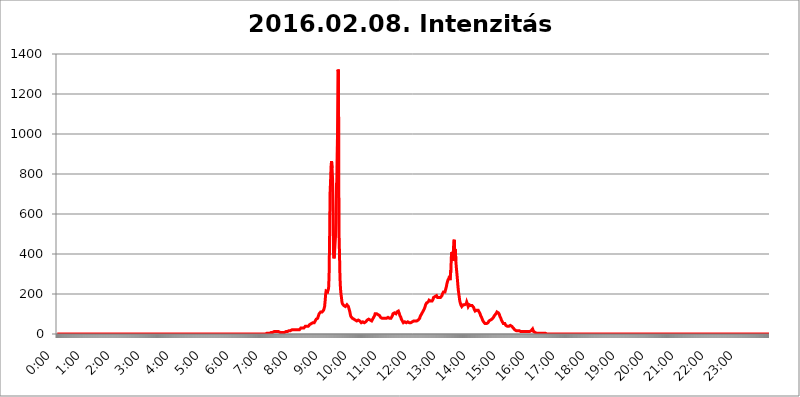
| Category | 2016.02.08. Intenzitás [W/m^2] |
|---|---|
| 0.0 | 0 |
| 0.0006944444444444445 | 0 |
| 0.001388888888888889 | 0 |
| 0.0020833333333333333 | 0 |
| 0.002777777777777778 | 0 |
| 0.003472222222222222 | 0 |
| 0.004166666666666667 | 0 |
| 0.004861111111111111 | 0 |
| 0.005555555555555556 | 0 |
| 0.0062499999999999995 | 0 |
| 0.006944444444444444 | 0 |
| 0.007638888888888889 | 0 |
| 0.008333333333333333 | 0 |
| 0.009027777777777779 | 0 |
| 0.009722222222222222 | 0 |
| 0.010416666666666666 | 0 |
| 0.011111111111111112 | 0 |
| 0.011805555555555555 | 0 |
| 0.012499999999999999 | 0 |
| 0.013194444444444444 | 0 |
| 0.013888888888888888 | 0 |
| 0.014583333333333332 | 0 |
| 0.015277777777777777 | 0 |
| 0.015972222222222224 | 0 |
| 0.016666666666666666 | 0 |
| 0.017361111111111112 | 0 |
| 0.018055555555555557 | 0 |
| 0.01875 | 0 |
| 0.019444444444444445 | 0 |
| 0.02013888888888889 | 0 |
| 0.020833333333333332 | 0 |
| 0.02152777777777778 | 0 |
| 0.022222222222222223 | 0 |
| 0.02291666666666667 | 0 |
| 0.02361111111111111 | 0 |
| 0.024305555555555556 | 0 |
| 0.024999999999999998 | 0 |
| 0.025694444444444447 | 0 |
| 0.02638888888888889 | 0 |
| 0.027083333333333334 | 0 |
| 0.027777777777777776 | 0 |
| 0.02847222222222222 | 0 |
| 0.029166666666666664 | 0 |
| 0.029861111111111113 | 0 |
| 0.030555555555555555 | 0 |
| 0.03125 | 0 |
| 0.03194444444444445 | 0 |
| 0.03263888888888889 | 0 |
| 0.03333333333333333 | 0 |
| 0.034027777777777775 | 0 |
| 0.034722222222222224 | 0 |
| 0.035416666666666666 | 0 |
| 0.036111111111111115 | 0 |
| 0.03680555555555556 | 0 |
| 0.0375 | 0 |
| 0.03819444444444444 | 0 |
| 0.03888888888888889 | 0 |
| 0.03958333333333333 | 0 |
| 0.04027777777777778 | 0 |
| 0.04097222222222222 | 0 |
| 0.041666666666666664 | 0 |
| 0.042361111111111106 | 0 |
| 0.04305555555555556 | 0 |
| 0.043750000000000004 | 0 |
| 0.044444444444444446 | 0 |
| 0.04513888888888889 | 0 |
| 0.04583333333333334 | 0 |
| 0.04652777777777778 | 0 |
| 0.04722222222222222 | 0 |
| 0.04791666666666666 | 0 |
| 0.04861111111111111 | 0 |
| 0.049305555555555554 | 0 |
| 0.049999999999999996 | 0 |
| 0.05069444444444445 | 0 |
| 0.051388888888888894 | 0 |
| 0.052083333333333336 | 0 |
| 0.05277777777777778 | 0 |
| 0.05347222222222222 | 0 |
| 0.05416666666666667 | 0 |
| 0.05486111111111111 | 0 |
| 0.05555555555555555 | 0 |
| 0.05625 | 0 |
| 0.05694444444444444 | 0 |
| 0.057638888888888885 | 0 |
| 0.05833333333333333 | 0 |
| 0.05902777777777778 | 0 |
| 0.059722222222222225 | 0 |
| 0.06041666666666667 | 0 |
| 0.061111111111111116 | 0 |
| 0.06180555555555556 | 0 |
| 0.0625 | 0 |
| 0.06319444444444444 | 0 |
| 0.06388888888888888 | 0 |
| 0.06458333333333334 | 0 |
| 0.06527777777777778 | 0 |
| 0.06597222222222222 | 0 |
| 0.06666666666666667 | 0 |
| 0.06736111111111111 | 0 |
| 0.06805555555555555 | 0 |
| 0.06874999999999999 | 0 |
| 0.06944444444444443 | 0 |
| 0.07013888888888889 | 0 |
| 0.07083333333333333 | 0 |
| 0.07152777777777779 | 0 |
| 0.07222222222222223 | 0 |
| 0.07291666666666667 | 0 |
| 0.07361111111111111 | 0 |
| 0.07430555555555556 | 0 |
| 0.075 | 0 |
| 0.07569444444444444 | 0 |
| 0.0763888888888889 | 0 |
| 0.07708333333333334 | 0 |
| 0.07777777777777778 | 0 |
| 0.07847222222222222 | 0 |
| 0.07916666666666666 | 0 |
| 0.0798611111111111 | 0 |
| 0.08055555555555556 | 0 |
| 0.08125 | 0 |
| 0.08194444444444444 | 0 |
| 0.08263888888888889 | 0 |
| 0.08333333333333333 | 0 |
| 0.08402777777777777 | 0 |
| 0.08472222222222221 | 0 |
| 0.08541666666666665 | 0 |
| 0.08611111111111112 | 0 |
| 0.08680555555555557 | 0 |
| 0.08750000000000001 | 0 |
| 0.08819444444444445 | 0 |
| 0.08888888888888889 | 0 |
| 0.08958333333333333 | 0 |
| 0.09027777777777778 | 0 |
| 0.09097222222222222 | 0 |
| 0.09166666666666667 | 0 |
| 0.09236111111111112 | 0 |
| 0.09305555555555556 | 0 |
| 0.09375 | 0 |
| 0.09444444444444444 | 0 |
| 0.09513888888888888 | 0 |
| 0.09583333333333333 | 0 |
| 0.09652777777777777 | 0 |
| 0.09722222222222222 | 0 |
| 0.09791666666666667 | 0 |
| 0.09861111111111111 | 0 |
| 0.09930555555555555 | 0 |
| 0.09999999999999999 | 0 |
| 0.10069444444444443 | 0 |
| 0.1013888888888889 | 0 |
| 0.10208333333333335 | 0 |
| 0.10277777777777779 | 0 |
| 0.10347222222222223 | 0 |
| 0.10416666666666667 | 0 |
| 0.10486111111111111 | 0 |
| 0.10555555555555556 | 0 |
| 0.10625 | 0 |
| 0.10694444444444444 | 0 |
| 0.1076388888888889 | 0 |
| 0.10833333333333334 | 0 |
| 0.10902777777777778 | 0 |
| 0.10972222222222222 | 0 |
| 0.1111111111111111 | 0 |
| 0.11180555555555556 | 0 |
| 0.11180555555555556 | 0 |
| 0.1125 | 0 |
| 0.11319444444444444 | 0 |
| 0.11388888888888889 | 0 |
| 0.11458333333333333 | 0 |
| 0.11527777777777777 | 0 |
| 0.11597222222222221 | 0 |
| 0.11666666666666665 | 0 |
| 0.1173611111111111 | 0 |
| 0.11805555555555557 | 0 |
| 0.11944444444444445 | 0 |
| 0.12013888888888889 | 0 |
| 0.12083333333333333 | 0 |
| 0.12152777777777778 | 0 |
| 0.12222222222222223 | 0 |
| 0.12291666666666667 | 0 |
| 0.12291666666666667 | 0 |
| 0.12361111111111112 | 0 |
| 0.12430555555555556 | 0 |
| 0.125 | 0 |
| 0.12569444444444444 | 0 |
| 0.12638888888888888 | 0 |
| 0.12708333333333333 | 0 |
| 0.16875 | 0 |
| 0.12847222222222224 | 0 |
| 0.12916666666666668 | 0 |
| 0.12986111111111112 | 0 |
| 0.13055555555555556 | 0 |
| 0.13125 | 0 |
| 0.13194444444444445 | 0 |
| 0.1326388888888889 | 0 |
| 0.13333333333333333 | 0 |
| 0.13402777777777777 | 0 |
| 0.13402777777777777 | 0 |
| 0.13472222222222222 | 0 |
| 0.13541666666666666 | 0 |
| 0.1361111111111111 | 0 |
| 0.13749999999999998 | 0 |
| 0.13819444444444443 | 0 |
| 0.1388888888888889 | 0 |
| 0.13958333333333334 | 0 |
| 0.14027777777777778 | 0 |
| 0.14097222222222222 | 0 |
| 0.14166666666666666 | 0 |
| 0.1423611111111111 | 0 |
| 0.14305555555555557 | 0 |
| 0.14375000000000002 | 0 |
| 0.14444444444444446 | 0 |
| 0.1451388888888889 | 0 |
| 0.1451388888888889 | 0 |
| 0.14652777777777778 | 0 |
| 0.14722222222222223 | 0 |
| 0.14791666666666667 | 0 |
| 0.1486111111111111 | 0 |
| 0.14930555555555555 | 0 |
| 0.15 | 0 |
| 0.15069444444444444 | 0 |
| 0.15138888888888888 | 0 |
| 0.15208333333333332 | 0 |
| 0.15277777777777776 | 0 |
| 0.15347222222222223 | 0 |
| 0.15416666666666667 | 0 |
| 0.15486111111111112 | 0 |
| 0.15555555555555556 | 0 |
| 0.15625 | 0 |
| 0.15694444444444444 | 0 |
| 0.15763888888888888 | 0 |
| 0.15833333333333333 | 0 |
| 0.15902777777777777 | 0 |
| 0.15972222222222224 | 0 |
| 0.16041666666666668 | 0 |
| 0.16111111111111112 | 0 |
| 0.16180555555555556 | 0 |
| 0.1625 | 0 |
| 0.16319444444444445 | 0 |
| 0.1638888888888889 | 0 |
| 0.16458333333333333 | 0 |
| 0.16527777777777777 | 0 |
| 0.16597222222222222 | 0 |
| 0.16666666666666666 | 0 |
| 0.1673611111111111 | 0 |
| 0.16805555555555554 | 0 |
| 0.16874999999999998 | 0 |
| 0.16944444444444443 | 0 |
| 0.17013888888888887 | 0 |
| 0.1708333333333333 | 0 |
| 0.17152777777777775 | 0 |
| 0.17222222222222225 | 0 |
| 0.1729166666666667 | 0 |
| 0.17361111111111113 | 0 |
| 0.17430555555555557 | 0 |
| 0.17500000000000002 | 0 |
| 0.17569444444444446 | 0 |
| 0.1763888888888889 | 0 |
| 0.17708333333333334 | 0 |
| 0.17777777777777778 | 0 |
| 0.17847222222222223 | 0 |
| 0.17916666666666667 | 0 |
| 0.1798611111111111 | 0 |
| 0.18055555555555555 | 0 |
| 0.18125 | 0 |
| 0.18194444444444444 | 0 |
| 0.1826388888888889 | 0 |
| 0.18333333333333335 | 0 |
| 0.1840277777777778 | 0 |
| 0.18472222222222223 | 0 |
| 0.18541666666666667 | 0 |
| 0.18611111111111112 | 0 |
| 0.18680555555555556 | 0 |
| 0.1875 | 0 |
| 0.18819444444444444 | 0 |
| 0.18888888888888888 | 0 |
| 0.18958333333333333 | 0 |
| 0.19027777777777777 | 0 |
| 0.1909722222222222 | 0 |
| 0.19166666666666665 | 0 |
| 0.19236111111111112 | 0 |
| 0.19305555555555554 | 0 |
| 0.19375 | 0 |
| 0.19444444444444445 | 0 |
| 0.1951388888888889 | 0 |
| 0.19583333333333333 | 0 |
| 0.19652777777777777 | 0 |
| 0.19722222222222222 | 0 |
| 0.19791666666666666 | 0 |
| 0.1986111111111111 | 0 |
| 0.19930555555555554 | 0 |
| 0.19999999999999998 | 0 |
| 0.20069444444444443 | 0 |
| 0.20138888888888887 | 0 |
| 0.2020833333333333 | 0 |
| 0.2027777777777778 | 0 |
| 0.2034722222222222 | 0 |
| 0.2041666666666667 | 0 |
| 0.20486111111111113 | 0 |
| 0.20555555555555557 | 0 |
| 0.20625000000000002 | 0 |
| 0.20694444444444446 | 0 |
| 0.2076388888888889 | 0 |
| 0.20833333333333334 | 0 |
| 0.20902777777777778 | 0 |
| 0.20972222222222223 | 0 |
| 0.21041666666666667 | 0 |
| 0.2111111111111111 | 0 |
| 0.21180555555555555 | 0 |
| 0.2125 | 0 |
| 0.21319444444444444 | 0 |
| 0.2138888888888889 | 0 |
| 0.21458333333333335 | 0 |
| 0.2152777777777778 | 0 |
| 0.21597222222222223 | 0 |
| 0.21666666666666667 | 0 |
| 0.21736111111111112 | 0 |
| 0.21805555555555556 | 0 |
| 0.21875 | 0 |
| 0.21944444444444444 | 0 |
| 0.22013888888888888 | 0 |
| 0.22083333333333333 | 0 |
| 0.22152777777777777 | 0 |
| 0.2222222222222222 | 0 |
| 0.22291666666666665 | 0 |
| 0.2236111111111111 | 0 |
| 0.22430555555555556 | 0 |
| 0.225 | 0 |
| 0.22569444444444445 | 0 |
| 0.2263888888888889 | 0 |
| 0.22708333333333333 | 0 |
| 0.22777777777777777 | 0 |
| 0.22847222222222222 | 0 |
| 0.22916666666666666 | 0 |
| 0.2298611111111111 | 0 |
| 0.23055555555555554 | 0 |
| 0.23124999999999998 | 0 |
| 0.23194444444444443 | 0 |
| 0.23263888888888887 | 0 |
| 0.2333333333333333 | 0 |
| 0.2340277777777778 | 0 |
| 0.2347222222222222 | 0 |
| 0.2354166666666667 | 0 |
| 0.23611111111111113 | 0 |
| 0.23680555555555557 | 0 |
| 0.23750000000000002 | 0 |
| 0.23819444444444446 | 0 |
| 0.2388888888888889 | 0 |
| 0.23958333333333334 | 0 |
| 0.24027777777777778 | 0 |
| 0.24097222222222223 | 0 |
| 0.24166666666666667 | 0 |
| 0.2423611111111111 | 0 |
| 0.24305555555555555 | 0 |
| 0.24375 | 0 |
| 0.24444444444444446 | 0 |
| 0.24513888888888888 | 0 |
| 0.24583333333333335 | 0 |
| 0.2465277777777778 | 0 |
| 0.24722222222222223 | 0 |
| 0.24791666666666667 | 0 |
| 0.24861111111111112 | 0 |
| 0.24930555555555556 | 0 |
| 0.25 | 0 |
| 0.25069444444444444 | 0 |
| 0.2513888888888889 | 0 |
| 0.2520833333333333 | 0 |
| 0.25277777777777777 | 0 |
| 0.2534722222222222 | 0 |
| 0.25416666666666665 | 0 |
| 0.2548611111111111 | 0 |
| 0.2555555555555556 | 0 |
| 0.25625000000000003 | 0 |
| 0.2569444444444445 | 0 |
| 0.2576388888888889 | 0 |
| 0.25833333333333336 | 0 |
| 0.2590277777777778 | 0 |
| 0.25972222222222224 | 0 |
| 0.2604166666666667 | 0 |
| 0.2611111111111111 | 0 |
| 0.26180555555555557 | 0 |
| 0.2625 | 0 |
| 0.26319444444444445 | 0 |
| 0.2638888888888889 | 0 |
| 0.26458333333333334 | 0 |
| 0.2652777777777778 | 0 |
| 0.2659722222222222 | 0 |
| 0.26666666666666666 | 0 |
| 0.2673611111111111 | 0 |
| 0.26805555555555555 | 0 |
| 0.26875 | 0 |
| 0.26944444444444443 | 0 |
| 0.2701388888888889 | 0 |
| 0.2708333333333333 | 0 |
| 0.27152777777777776 | 0 |
| 0.2722222222222222 | 0 |
| 0.27291666666666664 | 0 |
| 0.2736111111111111 | 0 |
| 0.2743055555555555 | 0 |
| 0.27499999999999997 | 0 |
| 0.27569444444444446 | 0 |
| 0.27638888888888885 | 0 |
| 0.27708333333333335 | 0 |
| 0.2777777777777778 | 0 |
| 0.27847222222222223 | 0 |
| 0.2791666666666667 | 0 |
| 0.2798611111111111 | 0 |
| 0.28055555555555556 | 0 |
| 0.28125 | 0 |
| 0.28194444444444444 | 0 |
| 0.2826388888888889 | 0 |
| 0.2833333333333333 | 0 |
| 0.28402777777777777 | 0 |
| 0.2847222222222222 | 0 |
| 0.28541666666666665 | 0 |
| 0.28611111111111115 | 0 |
| 0.28680555555555554 | 0 |
| 0.28750000000000003 | 0 |
| 0.2881944444444445 | 0 |
| 0.2888888888888889 | 0 |
| 0.28958333333333336 | 0 |
| 0.2902777777777778 | 0 |
| 0.29097222222222224 | 0 |
| 0.2916666666666667 | 0 |
| 0.2923611111111111 | 3.525 |
| 0.29305555555555557 | 3.525 |
| 0.29375 | 3.525 |
| 0.29444444444444445 | 3.525 |
| 0.2951388888888889 | 3.525 |
| 0.29583333333333334 | 3.525 |
| 0.2965277777777778 | 3.525 |
| 0.2972222222222222 | 3.525 |
| 0.29791666666666666 | 3.525 |
| 0.2986111111111111 | 3.525 |
| 0.29930555555555555 | 7.887 |
| 0.3 | 7.887 |
| 0.30069444444444443 | 7.887 |
| 0.3013888888888889 | 7.887 |
| 0.3020833333333333 | 7.887 |
| 0.30277777777777776 | 7.887 |
| 0.3034722222222222 | 7.887 |
| 0.30416666666666664 | 12.257 |
| 0.3048611111111111 | 12.257 |
| 0.3055555555555555 | 12.257 |
| 0.30624999999999997 | 12.257 |
| 0.3069444444444444 | 12.257 |
| 0.3076388888888889 | 12.257 |
| 0.30833333333333335 | 12.257 |
| 0.3090277777777778 | 12.257 |
| 0.30972222222222223 | 12.257 |
| 0.3104166666666667 | 12.257 |
| 0.3111111111111111 | 12.257 |
| 0.31180555555555556 | 12.257 |
| 0.3125 | 7.887 |
| 0.31319444444444444 | 7.887 |
| 0.3138888888888889 | 7.887 |
| 0.3145833333333333 | 7.887 |
| 0.31527777777777777 | 7.887 |
| 0.3159722222222222 | 7.887 |
| 0.31666666666666665 | 7.887 |
| 0.31736111111111115 | 7.887 |
| 0.31805555555555554 | 7.887 |
| 0.31875000000000003 | 7.887 |
| 0.3194444444444445 | 7.887 |
| 0.3201388888888889 | 12.257 |
| 0.32083333333333336 | 12.257 |
| 0.3215277777777778 | 12.257 |
| 0.32222222222222224 | 12.257 |
| 0.3229166666666667 | 12.257 |
| 0.3236111111111111 | 12.257 |
| 0.32430555555555557 | 16.636 |
| 0.325 | 16.636 |
| 0.32569444444444445 | 16.636 |
| 0.3263888888888889 | 16.636 |
| 0.32708333333333334 | 16.636 |
| 0.3277777777777778 | 21.024 |
| 0.3284722222222222 | 21.024 |
| 0.32916666666666666 | 21.024 |
| 0.3298611111111111 | 21.024 |
| 0.33055555555555555 | 21.024 |
| 0.33125 | 21.024 |
| 0.33194444444444443 | 21.024 |
| 0.3326388888888889 | 21.024 |
| 0.3333333333333333 | 21.024 |
| 0.3340277777777778 | 21.024 |
| 0.3347222222222222 | 21.024 |
| 0.3354166666666667 | 21.024 |
| 0.3361111111111111 | 21.024 |
| 0.3368055555555556 | 21.024 |
| 0.33749999999999997 | 21.024 |
| 0.33819444444444446 | 21.024 |
| 0.33888888888888885 | 21.024 |
| 0.33958333333333335 | 21.024 |
| 0.34027777777777773 | 25.419 |
| 0.34097222222222223 | 25.419 |
| 0.3416666666666666 | 29.823 |
| 0.3423611111111111 | 29.823 |
| 0.3430555555555555 | 29.823 |
| 0.34375 | 29.823 |
| 0.3444444444444445 | 29.823 |
| 0.3451388888888889 | 29.823 |
| 0.3458333333333334 | 29.823 |
| 0.34652777777777777 | 34.234 |
| 0.34722222222222227 | 34.234 |
| 0.34791666666666665 | 38.653 |
| 0.34861111111111115 | 38.653 |
| 0.34930555555555554 | 38.653 |
| 0.35000000000000003 | 38.653 |
| 0.3506944444444444 | 34.234 |
| 0.3513888888888889 | 34.234 |
| 0.3520833333333333 | 38.653 |
| 0.3527777777777778 | 38.653 |
| 0.3534722222222222 | 43.079 |
| 0.3541666666666667 | 47.511 |
| 0.3548611111111111 | 47.511 |
| 0.35555555555555557 | 51.951 |
| 0.35625 | 51.951 |
| 0.35694444444444445 | 51.951 |
| 0.3576388888888889 | 56.398 |
| 0.35833333333333334 | 56.398 |
| 0.3590277777777778 | 56.398 |
| 0.3597222222222222 | 56.398 |
| 0.36041666666666666 | 56.398 |
| 0.3611111111111111 | 60.85 |
| 0.36180555555555555 | 65.31 |
| 0.3625 | 69.775 |
| 0.36319444444444443 | 74.246 |
| 0.3638888888888889 | 74.246 |
| 0.3645833333333333 | 74.246 |
| 0.3652777777777778 | 78.722 |
| 0.3659722222222222 | 87.692 |
| 0.3666666666666667 | 92.184 |
| 0.3673611111111111 | 101.184 |
| 0.3680555555555556 | 101.184 |
| 0.36874999999999997 | 101.184 |
| 0.36944444444444446 | 110.201 |
| 0.37013888888888885 | 110.201 |
| 0.37083333333333335 | 114.716 |
| 0.37152777777777773 | 110.201 |
| 0.37222222222222223 | 110.201 |
| 0.3729166666666666 | 114.716 |
| 0.3736111111111111 | 119.235 |
| 0.3743055555555555 | 123.758 |
| 0.375 | 137.347 |
| 0.3756944444444445 | 164.605 |
| 0.3763888888888889 | 196.497 |
| 0.3770833333333334 | 214.746 |
| 0.37777777777777777 | 219.309 |
| 0.37847222222222227 | 210.182 |
| 0.37916666666666665 | 210.182 |
| 0.37986111111111115 | 214.746 |
| 0.38055555555555554 | 228.436 |
| 0.38125000000000003 | 287.709 |
| 0.3819444444444444 | 462.786 |
| 0.3826388888888889 | 703.762 |
| 0.3833333333333333 | 763.674 |
| 0.3840277777777778 | 837.682 |
| 0.3847222222222222 | 864.493 |
| 0.3854166666666667 | 829.981 |
| 0.3861111111111111 | 779.42 |
| 0.38680555555555557 | 621.613 |
| 0.3875 | 400.638 |
| 0.38819444444444445 | 378.224 |
| 0.3888888888888889 | 405.108 |
| 0.38958333333333334 | 449.551 |
| 0.3902777777777778 | 489.108 |
| 0.3909722222222222 | 558.261 |
| 0.39166666666666666 | 755.766 |
| 0.3923611111111111 | 727.896 |
| 0.39305555555555555 | 984.98 |
| 0.39375 | 1322.082 |
| 0.39444444444444443 | 1313.406 |
| 0.3951388888888889 | 510.885 |
| 0.3958333333333333 | 405.108 |
| 0.3965277777777778 | 283.156 |
| 0.3972222222222222 | 228.436 |
| 0.3979166666666667 | 201.058 |
| 0.3986111111111111 | 182.82 |
| 0.3993055555555556 | 160.056 |
| 0.39999999999999997 | 150.964 |
| 0.40069444444444446 | 150.964 |
| 0.40138888888888885 | 146.423 |
| 0.40208333333333335 | 141.884 |
| 0.40277777777777773 | 137.347 |
| 0.40347222222222223 | 137.347 |
| 0.4041666666666666 | 137.347 |
| 0.4048611111111111 | 137.347 |
| 0.4055555555555555 | 141.884 |
| 0.40625 | 146.423 |
| 0.4069444444444445 | 146.423 |
| 0.4076388888888889 | 146.423 |
| 0.4083333333333334 | 137.347 |
| 0.40902777777777777 | 128.284 |
| 0.40972222222222227 | 119.235 |
| 0.41041666666666665 | 110.201 |
| 0.41111111111111115 | 96.682 |
| 0.41180555555555554 | 87.692 |
| 0.41250000000000003 | 83.205 |
| 0.4131944444444444 | 83.205 |
| 0.4138888888888889 | 78.722 |
| 0.4145833333333333 | 74.246 |
| 0.4152777777777778 | 74.246 |
| 0.4159722222222222 | 74.246 |
| 0.4166666666666667 | 74.246 |
| 0.4173611111111111 | 74.246 |
| 0.41805555555555557 | 69.775 |
| 0.41875 | 65.31 |
| 0.41944444444444445 | 65.31 |
| 0.4201388888888889 | 65.31 |
| 0.42083333333333334 | 65.31 |
| 0.4215277777777778 | 65.31 |
| 0.4222222222222222 | 69.775 |
| 0.42291666666666666 | 69.775 |
| 0.4236111111111111 | 65.31 |
| 0.42430555555555555 | 65.31 |
| 0.425 | 65.31 |
| 0.42569444444444443 | 60.85 |
| 0.4263888888888889 | 56.398 |
| 0.4270833333333333 | 56.398 |
| 0.4277777777777778 | 60.85 |
| 0.4284722222222222 | 60.85 |
| 0.4291666666666667 | 60.85 |
| 0.4298611111111111 | 56.398 |
| 0.4305555555555556 | 56.398 |
| 0.43124999999999997 | 56.398 |
| 0.43194444444444446 | 56.398 |
| 0.43263888888888885 | 60.85 |
| 0.43333333333333335 | 65.31 |
| 0.43402777777777773 | 65.31 |
| 0.43472222222222223 | 69.775 |
| 0.4354166666666666 | 74.246 |
| 0.4361111111111111 | 74.246 |
| 0.4368055555555555 | 74.246 |
| 0.4375 | 74.246 |
| 0.4381944444444445 | 69.775 |
| 0.4388888888888889 | 69.775 |
| 0.4395833333333334 | 65.31 |
| 0.44027777777777777 | 65.31 |
| 0.44097222222222227 | 65.31 |
| 0.44166666666666665 | 69.775 |
| 0.44236111111111115 | 74.246 |
| 0.44305555555555554 | 78.722 |
| 0.44375000000000003 | 83.205 |
| 0.4444444444444444 | 87.692 |
| 0.4451388888888889 | 92.184 |
| 0.4458333333333333 | 101.184 |
| 0.4465277777777778 | 101.184 |
| 0.4472222222222222 | 105.69 |
| 0.4479166666666667 | 101.184 |
| 0.4486111111111111 | 101.184 |
| 0.44930555555555557 | 101.184 |
| 0.45 | 96.682 |
| 0.45069444444444445 | 96.682 |
| 0.4513888888888889 | 92.184 |
| 0.45208333333333334 | 92.184 |
| 0.4527777777777778 | 87.692 |
| 0.4534722222222222 | 83.205 |
| 0.45416666666666666 | 83.205 |
| 0.4548611111111111 | 78.722 |
| 0.45555555555555555 | 78.722 |
| 0.45625 | 78.722 |
| 0.45694444444444443 | 78.722 |
| 0.4576388888888889 | 78.722 |
| 0.4583333333333333 | 78.722 |
| 0.4590277777777778 | 78.722 |
| 0.4597222222222222 | 78.722 |
| 0.4604166666666667 | 74.246 |
| 0.4611111111111111 | 74.246 |
| 0.4618055555555556 | 78.722 |
| 0.46249999999999997 | 78.722 |
| 0.46319444444444446 | 83.205 |
| 0.46388888888888885 | 83.205 |
| 0.46458333333333335 | 83.205 |
| 0.46527777777777773 | 83.205 |
| 0.46597222222222223 | 78.722 |
| 0.4666666666666666 | 74.246 |
| 0.4673611111111111 | 78.722 |
| 0.4680555555555555 | 78.722 |
| 0.46875 | 83.205 |
| 0.4694444444444445 | 83.205 |
| 0.4701388888888889 | 92.184 |
| 0.4708333333333334 | 101.184 |
| 0.47152777777777777 | 101.184 |
| 0.47222222222222227 | 105.69 |
| 0.47291666666666665 | 105.69 |
| 0.47361111111111115 | 105.69 |
| 0.47430555555555554 | 101.184 |
| 0.47500000000000003 | 101.184 |
| 0.4756944444444444 | 101.184 |
| 0.4763888888888889 | 110.201 |
| 0.4770833333333333 | 110.201 |
| 0.4777777777777778 | 114.716 |
| 0.4784722222222222 | 114.716 |
| 0.4791666666666667 | 110.201 |
| 0.4798611111111111 | 101.184 |
| 0.48055555555555557 | 92.184 |
| 0.48125 | 87.692 |
| 0.48194444444444445 | 83.205 |
| 0.4826388888888889 | 74.246 |
| 0.48333333333333334 | 69.775 |
| 0.4840277777777778 | 65.31 |
| 0.4847222222222222 | 60.85 |
| 0.48541666666666666 | 56.398 |
| 0.4861111111111111 | 56.398 |
| 0.48680555555555555 | 60.85 |
| 0.4875 | 60.85 |
| 0.48819444444444443 | 56.398 |
| 0.4888888888888889 | 56.398 |
| 0.4895833333333333 | 56.398 |
| 0.4902777777777778 | 56.398 |
| 0.4909722222222222 | 60.85 |
| 0.4916666666666667 | 60.85 |
| 0.4923611111111111 | 56.398 |
| 0.4930555555555556 | 56.398 |
| 0.49374999999999997 | 56.398 |
| 0.49444444444444446 | 56.398 |
| 0.49513888888888885 | 56.398 |
| 0.49583333333333335 | 56.398 |
| 0.49652777777777773 | 60.85 |
| 0.49722222222222223 | 60.85 |
| 0.4979166666666666 | 60.85 |
| 0.4986111111111111 | 60.85 |
| 0.4993055555555555 | 65.31 |
| 0.5 | 65.31 |
| 0.5006944444444444 | 65.31 |
| 0.5013888888888889 | 65.31 |
| 0.5020833333333333 | 65.31 |
| 0.5027777777777778 | 60.85 |
| 0.5034722222222222 | 65.31 |
| 0.5041666666666667 | 65.31 |
| 0.5048611111111111 | 65.31 |
| 0.5055555555555555 | 65.31 |
| 0.50625 | 69.775 |
| 0.5069444444444444 | 69.775 |
| 0.5076388888888889 | 74.246 |
| 0.5083333333333333 | 78.722 |
| 0.5090277777777777 | 87.692 |
| 0.5097222222222222 | 92.184 |
| 0.5104166666666666 | 96.682 |
| 0.5111111111111112 | 101.184 |
| 0.5118055555555555 | 105.69 |
| 0.5125000000000001 | 110.201 |
| 0.5131944444444444 | 114.716 |
| 0.513888888888889 | 119.235 |
| 0.5145833333333333 | 123.758 |
| 0.5152777777777778 | 128.284 |
| 0.5159722222222222 | 137.347 |
| 0.5166666666666667 | 146.423 |
| 0.517361111111111 | 150.964 |
| 0.5180555555555556 | 155.509 |
| 0.5187499999999999 | 160.056 |
| 0.5194444444444445 | 160.056 |
| 0.5201388888888888 | 160.056 |
| 0.5208333333333334 | 164.605 |
| 0.5215277777777778 | 169.156 |
| 0.5222222222222223 | 169.156 |
| 0.5229166666666667 | 169.156 |
| 0.5236111111111111 | 164.605 |
| 0.5243055555555556 | 164.605 |
| 0.525 | 164.605 |
| 0.5256944444444445 | 164.605 |
| 0.5263888888888889 | 164.605 |
| 0.5270833333333333 | 173.709 |
| 0.5277777777777778 | 182.82 |
| 0.5284722222222222 | 187.378 |
| 0.5291666666666667 | 187.378 |
| 0.5298611111111111 | 187.378 |
| 0.5305555555555556 | 191.937 |
| 0.53125 | 191.937 |
| 0.5319444444444444 | 191.937 |
| 0.5326388888888889 | 187.378 |
| 0.5333333333333333 | 182.82 |
| 0.5340277777777778 | 182.82 |
| 0.5347222222222222 | 182.82 |
| 0.5354166666666667 | 182.82 |
| 0.5361111111111111 | 182.82 |
| 0.5368055555555555 | 182.82 |
| 0.5375 | 182.82 |
| 0.5381944444444444 | 182.82 |
| 0.5388888888888889 | 187.378 |
| 0.5395833333333333 | 191.937 |
| 0.5402777777777777 | 201.058 |
| 0.5409722222222222 | 205.62 |
| 0.5416666666666666 | 210.182 |
| 0.5423611111111112 | 210.182 |
| 0.5430555555555555 | 210.182 |
| 0.5437500000000001 | 210.182 |
| 0.5444444444444444 | 219.309 |
| 0.545138888888889 | 228.436 |
| 0.5458333333333333 | 237.564 |
| 0.5465277777777778 | 251.251 |
| 0.5472222222222222 | 260.373 |
| 0.5479166666666667 | 269.49 |
| 0.548611111111111 | 274.047 |
| 0.5493055555555556 | 278.603 |
| 0.5499999999999999 | 287.709 |
| 0.5506944444444445 | 269.49 |
| 0.5513888888888888 | 274.047 |
| 0.5520833333333334 | 319.517 |
| 0.5527777777777778 | 387.202 |
| 0.5534722222222223 | 409.574 |
| 0.5541666666666667 | 378.224 |
| 0.5548611111111111 | 364.728 |
| 0.5555555555555556 | 414.035 |
| 0.55625 | 462.786 |
| 0.5569444444444445 | 471.582 |
| 0.5576388888888889 | 391.685 |
| 0.5583333333333333 | 422.943 |
| 0.5590277777777778 | 364.728 |
| 0.5597222222222222 | 333.113 |
| 0.5604166666666667 | 305.898 |
| 0.5611111111111111 | 278.603 |
| 0.5618055555555556 | 246.689 |
| 0.5625 | 219.309 |
| 0.5631944444444444 | 201.058 |
| 0.5638888888888889 | 182.82 |
| 0.5645833333333333 | 164.605 |
| 0.5652777777777778 | 155.509 |
| 0.5659722222222222 | 146.423 |
| 0.5666666666666667 | 141.884 |
| 0.5673611111111111 | 137.347 |
| 0.5680555555555555 | 137.347 |
| 0.56875 | 141.884 |
| 0.5694444444444444 | 146.423 |
| 0.5701388888888889 | 146.423 |
| 0.5708333333333333 | 146.423 |
| 0.5715277777777777 | 146.423 |
| 0.5722222222222222 | 146.423 |
| 0.5729166666666666 | 146.423 |
| 0.5736111111111112 | 150.964 |
| 0.5743055555555555 | 160.056 |
| 0.5750000000000001 | 155.509 |
| 0.5756944444444444 | 146.423 |
| 0.576388888888889 | 137.347 |
| 0.5770833333333333 | 141.884 |
| 0.5777777777777778 | 146.423 |
| 0.5784722222222222 | 146.423 |
| 0.5791666666666667 | 141.884 |
| 0.579861111111111 | 141.884 |
| 0.5805555555555556 | 141.884 |
| 0.5812499999999999 | 141.884 |
| 0.5819444444444445 | 141.884 |
| 0.5826388888888888 | 141.884 |
| 0.5833333333333334 | 137.347 |
| 0.5840277777777778 | 132.814 |
| 0.5847222222222223 | 123.758 |
| 0.5854166666666667 | 119.235 |
| 0.5861111111111111 | 114.716 |
| 0.5868055555555556 | 114.716 |
| 0.5875 | 119.235 |
| 0.5881944444444445 | 119.235 |
| 0.5888888888888889 | 119.235 |
| 0.5895833333333333 | 119.235 |
| 0.5902777777777778 | 119.235 |
| 0.5909722222222222 | 119.235 |
| 0.5916666666666667 | 110.201 |
| 0.5923611111111111 | 105.69 |
| 0.5930555555555556 | 101.184 |
| 0.59375 | 92.184 |
| 0.5944444444444444 | 87.692 |
| 0.5951388888888889 | 83.205 |
| 0.5958333333333333 | 78.722 |
| 0.5965277777777778 | 69.775 |
| 0.5972222222222222 | 65.31 |
| 0.5979166666666667 | 60.85 |
| 0.5986111111111111 | 56.398 |
| 0.5993055555555555 | 56.398 |
| 0.6 | 51.951 |
| 0.6006944444444444 | 51.951 |
| 0.6013888888888889 | 51.951 |
| 0.6020833333333333 | 51.951 |
| 0.6027777777777777 | 51.951 |
| 0.6034722222222222 | 56.398 |
| 0.6041666666666666 | 56.398 |
| 0.6048611111111112 | 60.85 |
| 0.6055555555555555 | 65.31 |
| 0.6062500000000001 | 65.31 |
| 0.6069444444444444 | 69.775 |
| 0.607638888888889 | 69.775 |
| 0.6083333333333333 | 69.775 |
| 0.6090277777777778 | 74.246 |
| 0.6097222222222222 | 74.246 |
| 0.6104166666666667 | 74.246 |
| 0.611111111111111 | 78.722 |
| 0.6118055555555556 | 83.205 |
| 0.6124999999999999 | 87.692 |
| 0.6131944444444445 | 92.184 |
| 0.6138888888888888 | 92.184 |
| 0.6145833333333334 | 96.682 |
| 0.6152777777777778 | 101.184 |
| 0.6159722222222223 | 105.69 |
| 0.6166666666666667 | 110.201 |
| 0.6173611111111111 | 110.201 |
| 0.6180555555555556 | 110.201 |
| 0.61875 | 105.69 |
| 0.6194444444444445 | 101.184 |
| 0.6201388888888889 | 96.682 |
| 0.6208333333333333 | 87.692 |
| 0.6215277777777778 | 83.205 |
| 0.6222222222222222 | 78.722 |
| 0.6229166666666667 | 69.775 |
| 0.6236111111111111 | 65.31 |
| 0.6243055555555556 | 60.85 |
| 0.625 | 56.398 |
| 0.6256944444444444 | 51.951 |
| 0.6263888888888889 | 56.398 |
| 0.6270833333333333 | 56.398 |
| 0.6277777777777778 | 51.951 |
| 0.6284722222222222 | 47.511 |
| 0.6291666666666667 | 43.079 |
| 0.6298611111111111 | 38.653 |
| 0.6305555555555555 | 38.653 |
| 0.63125 | 38.653 |
| 0.6319444444444444 | 34.234 |
| 0.6326388888888889 | 34.234 |
| 0.6333333333333333 | 38.653 |
| 0.6340277777777777 | 38.653 |
| 0.6347222222222222 | 38.653 |
| 0.6354166666666666 | 43.079 |
| 0.6361111111111112 | 43.079 |
| 0.6368055555555555 | 43.079 |
| 0.6375000000000001 | 38.653 |
| 0.6381944444444444 | 38.653 |
| 0.638888888888889 | 34.234 |
| 0.6395833333333333 | 29.823 |
| 0.6402777777777778 | 29.823 |
| 0.6409722222222222 | 25.419 |
| 0.6416666666666667 | 21.024 |
| 0.642361111111111 | 21.024 |
| 0.6430555555555556 | 21.024 |
| 0.6437499999999999 | 16.636 |
| 0.6444444444444445 | 16.636 |
| 0.6451388888888888 | 16.636 |
| 0.6458333333333334 | 16.636 |
| 0.6465277777777778 | 16.636 |
| 0.6472222222222223 | 16.636 |
| 0.6479166666666667 | 16.636 |
| 0.6486111111111111 | 16.636 |
| 0.6493055555555556 | 12.257 |
| 0.65 | 12.257 |
| 0.6506944444444445 | 12.257 |
| 0.6513888888888889 | 12.257 |
| 0.6520833333333333 | 12.257 |
| 0.6527777777777778 | 12.257 |
| 0.6534722222222222 | 12.257 |
| 0.6541666666666667 | 12.257 |
| 0.6548611111111111 | 12.257 |
| 0.6555555555555556 | 12.257 |
| 0.65625 | 12.257 |
| 0.6569444444444444 | 12.257 |
| 0.6576388888888889 | 12.257 |
| 0.6583333333333333 | 12.257 |
| 0.6590277777777778 | 12.257 |
| 0.6597222222222222 | 12.257 |
| 0.6604166666666667 | 12.257 |
| 0.6611111111111111 | 12.257 |
| 0.6618055555555555 | 12.257 |
| 0.6625 | 12.257 |
| 0.6631944444444444 | 16.636 |
| 0.6638888888888889 | 16.636 |
| 0.6645833333333333 | 16.636 |
| 0.6652777777777777 | 16.636 |
| 0.6659722222222222 | 21.024 |
| 0.6666666666666666 | 25.419 |
| 0.6673611111111111 | 25.419 |
| 0.6680555555555556 | 12.257 |
| 0.6687500000000001 | 12.257 |
| 0.6694444444444444 | 7.887 |
| 0.6701388888888888 | 7.887 |
| 0.6708333333333334 | 7.887 |
| 0.6715277777777778 | 7.887 |
| 0.6722222222222222 | 3.525 |
| 0.6729166666666666 | 3.525 |
| 0.6736111111111112 | 3.525 |
| 0.6743055555555556 | 3.525 |
| 0.6749999999999999 | 3.525 |
| 0.6756944444444444 | 3.525 |
| 0.6763888888888889 | 3.525 |
| 0.6770833333333334 | 3.525 |
| 0.6777777777777777 | 3.525 |
| 0.6784722222222223 | 3.525 |
| 0.6791666666666667 | 3.525 |
| 0.6798611111111111 | 3.525 |
| 0.6805555555555555 | 3.525 |
| 0.68125 | 3.525 |
| 0.6819444444444445 | 3.525 |
| 0.6826388888888889 | 3.525 |
| 0.6833333333333332 | 3.525 |
| 0.6840277777777778 | 0 |
| 0.6847222222222222 | 3.525 |
| 0.6854166666666667 | 0 |
| 0.686111111111111 | 0 |
| 0.6868055555555556 | 0 |
| 0.6875 | 0 |
| 0.6881944444444444 | 0 |
| 0.688888888888889 | 0 |
| 0.6895833333333333 | 0 |
| 0.6902777777777778 | 0 |
| 0.6909722222222222 | 0 |
| 0.6916666666666668 | 0 |
| 0.6923611111111111 | 0 |
| 0.6930555555555555 | 0 |
| 0.69375 | 0 |
| 0.6944444444444445 | 0 |
| 0.6951388888888889 | 0 |
| 0.6958333333333333 | 0 |
| 0.6965277777777777 | 0 |
| 0.6972222222222223 | 0 |
| 0.6979166666666666 | 0 |
| 0.6986111111111111 | 0 |
| 0.6993055555555556 | 0 |
| 0.7000000000000001 | 0 |
| 0.7006944444444444 | 0 |
| 0.7013888888888888 | 0 |
| 0.7020833333333334 | 0 |
| 0.7027777777777778 | 0 |
| 0.7034722222222222 | 0 |
| 0.7041666666666666 | 0 |
| 0.7048611111111112 | 0 |
| 0.7055555555555556 | 0 |
| 0.7062499999999999 | 0 |
| 0.7069444444444444 | 0 |
| 0.7076388888888889 | 0 |
| 0.7083333333333334 | 0 |
| 0.7090277777777777 | 0 |
| 0.7097222222222223 | 0 |
| 0.7104166666666667 | 0 |
| 0.7111111111111111 | 0 |
| 0.7118055555555555 | 0 |
| 0.7125 | 0 |
| 0.7131944444444445 | 0 |
| 0.7138888888888889 | 0 |
| 0.7145833333333332 | 0 |
| 0.7152777777777778 | 0 |
| 0.7159722222222222 | 0 |
| 0.7166666666666667 | 0 |
| 0.717361111111111 | 0 |
| 0.7180555555555556 | 0 |
| 0.71875 | 0 |
| 0.7194444444444444 | 0 |
| 0.720138888888889 | 0 |
| 0.7208333333333333 | 0 |
| 0.7215277777777778 | 0 |
| 0.7222222222222222 | 0 |
| 0.7229166666666668 | 0 |
| 0.7236111111111111 | 0 |
| 0.7243055555555555 | 0 |
| 0.725 | 0 |
| 0.7256944444444445 | 0 |
| 0.7263888888888889 | 0 |
| 0.7270833333333333 | 0 |
| 0.7277777777777777 | 0 |
| 0.7284722222222223 | 0 |
| 0.7291666666666666 | 0 |
| 0.7298611111111111 | 0 |
| 0.7305555555555556 | 0 |
| 0.7312500000000001 | 0 |
| 0.7319444444444444 | 0 |
| 0.7326388888888888 | 0 |
| 0.7333333333333334 | 0 |
| 0.7340277777777778 | 0 |
| 0.7347222222222222 | 0 |
| 0.7354166666666666 | 0 |
| 0.7361111111111112 | 0 |
| 0.7368055555555556 | 0 |
| 0.7374999999999999 | 0 |
| 0.7381944444444444 | 0 |
| 0.7388888888888889 | 0 |
| 0.7395833333333334 | 0 |
| 0.7402777777777777 | 0 |
| 0.7409722222222223 | 0 |
| 0.7416666666666667 | 0 |
| 0.7423611111111111 | 0 |
| 0.7430555555555555 | 0 |
| 0.74375 | 0 |
| 0.7444444444444445 | 0 |
| 0.7451388888888889 | 0 |
| 0.7458333333333332 | 0 |
| 0.7465277777777778 | 0 |
| 0.7472222222222222 | 0 |
| 0.7479166666666667 | 0 |
| 0.748611111111111 | 0 |
| 0.7493055555555556 | 0 |
| 0.75 | 0 |
| 0.7506944444444444 | 0 |
| 0.751388888888889 | 0 |
| 0.7520833333333333 | 0 |
| 0.7527777777777778 | 0 |
| 0.7534722222222222 | 0 |
| 0.7541666666666668 | 0 |
| 0.7548611111111111 | 0 |
| 0.7555555555555555 | 0 |
| 0.75625 | 0 |
| 0.7569444444444445 | 0 |
| 0.7576388888888889 | 0 |
| 0.7583333333333333 | 0 |
| 0.7590277777777777 | 0 |
| 0.7597222222222223 | 0 |
| 0.7604166666666666 | 0 |
| 0.7611111111111111 | 0 |
| 0.7618055555555556 | 0 |
| 0.7625000000000001 | 0 |
| 0.7631944444444444 | 0 |
| 0.7638888888888888 | 0 |
| 0.7645833333333334 | 0 |
| 0.7652777777777778 | 0 |
| 0.7659722222222222 | 0 |
| 0.7666666666666666 | 0 |
| 0.7673611111111112 | 0 |
| 0.7680555555555556 | 0 |
| 0.7687499999999999 | 0 |
| 0.7694444444444444 | 0 |
| 0.7701388888888889 | 0 |
| 0.7708333333333334 | 0 |
| 0.7715277777777777 | 0 |
| 0.7722222222222223 | 0 |
| 0.7729166666666667 | 0 |
| 0.7736111111111111 | 0 |
| 0.7743055555555555 | 0 |
| 0.775 | 0 |
| 0.7756944444444445 | 0 |
| 0.7763888888888889 | 0 |
| 0.7770833333333332 | 0 |
| 0.7777777777777778 | 0 |
| 0.7784722222222222 | 0 |
| 0.7791666666666667 | 0 |
| 0.779861111111111 | 0 |
| 0.7805555555555556 | 0 |
| 0.78125 | 0 |
| 0.7819444444444444 | 0 |
| 0.782638888888889 | 0 |
| 0.7833333333333333 | 0 |
| 0.7840277777777778 | 0 |
| 0.7847222222222222 | 0 |
| 0.7854166666666668 | 0 |
| 0.7861111111111111 | 0 |
| 0.7868055555555555 | 0 |
| 0.7875 | 0 |
| 0.7881944444444445 | 0 |
| 0.7888888888888889 | 0 |
| 0.7895833333333333 | 0 |
| 0.7902777777777777 | 0 |
| 0.7909722222222223 | 0 |
| 0.7916666666666666 | 0 |
| 0.7923611111111111 | 0 |
| 0.7930555555555556 | 0 |
| 0.7937500000000001 | 0 |
| 0.7944444444444444 | 0 |
| 0.7951388888888888 | 0 |
| 0.7958333333333334 | 0 |
| 0.7965277777777778 | 0 |
| 0.7972222222222222 | 0 |
| 0.7979166666666666 | 0 |
| 0.7986111111111112 | 0 |
| 0.7993055555555556 | 0 |
| 0.7999999999999999 | 0 |
| 0.8006944444444444 | 0 |
| 0.8013888888888889 | 0 |
| 0.8020833333333334 | 0 |
| 0.8027777777777777 | 0 |
| 0.8034722222222223 | 0 |
| 0.8041666666666667 | 0 |
| 0.8048611111111111 | 0 |
| 0.8055555555555555 | 0 |
| 0.80625 | 0 |
| 0.8069444444444445 | 0 |
| 0.8076388888888889 | 0 |
| 0.8083333333333332 | 0 |
| 0.8090277777777778 | 0 |
| 0.8097222222222222 | 0 |
| 0.8104166666666667 | 0 |
| 0.811111111111111 | 0 |
| 0.8118055555555556 | 0 |
| 0.8125 | 0 |
| 0.8131944444444444 | 0 |
| 0.813888888888889 | 0 |
| 0.8145833333333333 | 0 |
| 0.8152777777777778 | 0 |
| 0.8159722222222222 | 0 |
| 0.8166666666666668 | 0 |
| 0.8173611111111111 | 0 |
| 0.8180555555555555 | 0 |
| 0.81875 | 0 |
| 0.8194444444444445 | 0 |
| 0.8201388888888889 | 0 |
| 0.8208333333333333 | 0 |
| 0.8215277777777777 | 0 |
| 0.8222222222222223 | 0 |
| 0.8229166666666666 | 0 |
| 0.8236111111111111 | 0 |
| 0.8243055555555556 | 0 |
| 0.8250000000000001 | 0 |
| 0.8256944444444444 | 0 |
| 0.8263888888888888 | 0 |
| 0.8270833333333334 | 0 |
| 0.8277777777777778 | 0 |
| 0.8284722222222222 | 0 |
| 0.8291666666666666 | 0 |
| 0.8298611111111112 | 0 |
| 0.8305555555555556 | 0 |
| 0.8312499999999999 | 0 |
| 0.8319444444444444 | 0 |
| 0.8326388888888889 | 0 |
| 0.8333333333333334 | 0 |
| 0.8340277777777777 | 0 |
| 0.8347222222222223 | 0 |
| 0.8354166666666667 | 0 |
| 0.8361111111111111 | 0 |
| 0.8368055555555555 | 0 |
| 0.8375 | 0 |
| 0.8381944444444445 | 0 |
| 0.8388888888888889 | 0 |
| 0.8395833333333332 | 0 |
| 0.8402777777777778 | 0 |
| 0.8409722222222222 | 0 |
| 0.8416666666666667 | 0 |
| 0.842361111111111 | 0 |
| 0.8430555555555556 | 0 |
| 0.84375 | 0 |
| 0.8444444444444444 | 0 |
| 0.845138888888889 | 0 |
| 0.8458333333333333 | 0 |
| 0.8465277777777778 | 0 |
| 0.8472222222222222 | 0 |
| 0.8479166666666668 | 0 |
| 0.8486111111111111 | 0 |
| 0.8493055555555555 | 0 |
| 0.85 | 0 |
| 0.8506944444444445 | 0 |
| 0.8513888888888889 | 0 |
| 0.8520833333333333 | 0 |
| 0.8527777777777777 | 0 |
| 0.8534722222222223 | 0 |
| 0.8541666666666666 | 0 |
| 0.8548611111111111 | 0 |
| 0.8555555555555556 | 0 |
| 0.8562500000000001 | 0 |
| 0.8569444444444444 | 0 |
| 0.8576388888888888 | 0 |
| 0.8583333333333334 | 0 |
| 0.8590277777777778 | 0 |
| 0.8597222222222222 | 0 |
| 0.8604166666666666 | 0 |
| 0.8611111111111112 | 0 |
| 0.8618055555555556 | 0 |
| 0.8624999999999999 | 0 |
| 0.8631944444444444 | 0 |
| 0.8638888888888889 | 0 |
| 0.8645833333333334 | 0 |
| 0.8652777777777777 | 0 |
| 0.8659722222222223 | 0 |
| 0.8666666666666667 | 0 |
| 0.8673611111111111 | 0 |
| 0.8680555555555555 | 0 |
| 0.86875 | 0 |
| 0.8694444444444445 | 0 |
| 0.8701388888888889 | 0 |
| 0.8708333333333332 | 0 |
| 0.8715277777777778 | 0 |
| 0.8722222222222222 | 0 |
| 0.8729166666666667 | 0 |
| 0.873611111111111 | 0 |
| 0.8743055555555556 | 0 |
| 0.875 | 0 |
| 0.8756944444444444 | 0 |
| 0.876388888888889 | 0 |
| 0.8770833333333333 | 0 |
| 0.8777777777777778 | 0 |
| 0.8784722222222222 | 0 |
| 0.8791666666666668 | 0 |
| 0.8798611111111111 | 0 |
| 0.8805555555555555 | 0 |
| 0.88125 | 0 |
| 0.8819444444444445 | 0 |
| 0.8826388888888889 | 0 |
| 0.8833333333333333 | 0 |
| 0.8840277777777777 | 0 |
| 0.8847222222222223 | 0 |
| 0.8854166666666666 | 0 |
| 0.8861111111111111 | 0 |
| 0.8868055555555556 | 0 |
| 0.8875000000000001 | 0 |
| 0.8881944444444444 | 0 |
| 0.8888888888888888 | 0 |
| 0.8895833333333334 | 0 |
| 0.8902777777777778 | 0 |
| 0.8909722222222222 | 0 |
| 0.8916666666666666 | 0 |
| 0.8923611111111112 | 0 |
| 0.8930555555555556 | 0 |
| 0.8937499999999999 | 0 |
| 0.8944444444444444 | 0 |
| 0.8951388888888889 | 0 |
| 0.8958333333333334 | 0 |
| 0.8965277777777777 | 0 |
| 0.8972222222222223 | 0 |
| 0.8979166666666667 | 0 |
| 0.8986111111111111 | 0 |
| 0.8993055555555555 | 0 |
| 0.9 | 0 |
| 0.9006944444444445 | 0 |
| 0.9013888888888889 | 0 |
| 0.9020833333333332 | 0 |
| 0.9027777777777778 | 0 |
| 0.9034722222222222 | 0 |
| 0.9041666666666667 | 0 |
| 0.904861111111111 | 0 |
| 0.9055555555555556 | 0 |
| 0.90625 | 0 |
| 0.9069444444444444 | 0 |
| 0.907638888888889 | 0 |
| 0.9083333333333333 | 0 |
| 0.9090277777777778 | 0 |
| 0.9097222222222222 | 0 |
| 0.9104166666666668 | 0 |
| 0.9111111111111111 | 0 |
| 0.9118055555555555 | 0 |
| 0.9125 | 0 |
| 0.9131944444444445 | 0 |
| 0.9138888888888889 | 0 |
| 0.9145833333333333 | 0 |
| 0.9152777777777777 | 0 |
| 0.9159722222222223 | 0 |
| 0.9166666666666666 | 0 |
| 0.9173611111111111 | 0 |
| 0.9180555555555556 | 0 |
| 0.9187500000000001 | 0 |
| 0.9194444444444444 | 0 |
| 0.9201388888888888 | 0 |
| 0.9208333333333334 | 0 |
| 0.9215277777777778 | 0 |
| 0.9222222222222222 | 0 |
| 0.9229166666666666 | 0 |
| 0.9236111111111112 | 0 |
| 0.9243055555555556 | 0 |
| 0.9249999999999999 | 0 |
| 0.9256944444444444 | 0 |
| 0.9263888888888889 | 0 |
| 0.9270833333333334 | 0 |
| 0.9277777777777777 | 0 |
| 0.9284722222222223 | 0 |
| 0.9291666666666667 | 0 |
| 0.9298611111111111 | 0 |
| 0.9305555555555555 | 0 |
| 0.93125 | 0 |
| 0.9319444444444445 | 0 |
| 0.9326388888888889 | 0 |
| 0.9333333333333332 | 0 |
| 0.9340277777777778 | 0 |
| 0.9347222222222222 | 0 |
| 0.9354166666666667 | 0 |
| 0.936111111111111 | 0 |
| 0.9368055555555556 | 0 |
| 0.9375 | 0 |
| 0.9381944444444444 | 0 |
| 0.938888888888889 | 0 |
| 0.9395833333333333 | 0 |
| 0.9402777777777778 | 0 |
| 0.9409722222222222 | 0 |
| 0.9416666666666668 | 0 |
| 0.9423611111111111 | 0 |
| 0.9430555555555555 | 0 |
| 0.94375 | 0 |
| 0.9444444444444445 | 0 |
| 0.9451388888888889 | 0 |
| 0.9458333333333333 | 0 |
| 0.9465277777777777 | 0 |
| 0.9472222222222223 | 0 |
| 0.9479166666666666 | 0 |
| 0.9486111111111111 | 0 |
| 0.9493055555555556 | 0 |
| 0.9500000000000001 | 0 |
| 0.9506944444444444 | 0 |
| 0.9513888888888888 | 0 |
| 0.9520833333333334 | 0 |
| 0.9527777777777778 | 0 |
| 0.9534722222222222 | 0 |
| 0.9541666666666666 | 0 |
| 0.9548611111111112 | 0 |
| 0.9555555555555556 | 0 |
| 0.9562499999999999 | 0 |
| 0.9569444444444444 | 0 |
| 0.9576388888888889 | 0 |
| 0.9583333333333334 | 0 |
| 0.9590277777777777 | 0 |
| 0.9597222222222223 | 0 |
| 0.9604166666666667 | 0 |
| 0.9611111111111111 | 0 |
| 0.9618055555555555 | 0 |
| 0.9625 | 0 |
| 0.9631944444444445 | 0 |
| 0.9638888888888889 | 0 |
| 0.9645833333333332 | 0 |
| 0.9652777777777778 | 0 |
| 0.9659722222222222 | 0 |
| 0.9666666666666667 | 0 |
| 0.967361111111111 | 0 |
| 0.9680555555555556 | 0 |
| 0.96875 | 0 |
| 0.9694444444444444 | 0 |
| 0.970138888888889 | 0 |
| 0.9708333333333333 | 0 |
| 0.9715277777777778 | 0 |
| 0.9722222222222222 | 0 |
| 0.9729166666666668 | 0 |
| 0.9736111111111111 | 0 |
| 0.9743055555555555 | 0 |
| 0.975 | 0 |
| 0.9756944444444445 | 0 |
| 0.9763888888888889 | 0 |
| 0.9770833333333333 | 0 |
| 0.9777777777777777 | 0 |
| 0.9784722222222223 | 0 |
| 0.9791666666666666 | 0 |
| 0.9798611111111111 | 0 |
| 0.9805555555555556 | 0 |
| 0.9812500000000001 | 0 |
| 0.9819444444444444 | 0 |
| 0.9826388888888888 | 0 |
| 0.9833333333333334 | 0 |
| 0.9840277777777778 | 0 |
| 0.9847222222222222 | 0 |
| 0.9854166666666666 | 0 |
| 0.9861111111111112 | 0 |
| 0.9868055555555556 | 0 |
| 0.9874999999999999 | 0 |
| 0.9881944444444444 | 0 |
| 0.9888888888888889 | 0 |
| 0.9895833333333334 | 0 |
| 0.9902777777777777 | 0 |
| 0.9909722222222223 | 0 |
| 0.9916666666666667 | 0 |
| 0.9923611111111111 | 0 |
| 0.9930555555555555 | 0 |
| 0.99375 | 0 |
| 0.9944444444444445 | 0 |
| 0.9951388888888889 | 0 |
| 0.9958333333333332 | 0 |
| 0.9965277777777778 | 0 |
| 0.9972222222222222 | 0 |
| 0.9979166666666667 | 0 |
| 0.998611111111111 | 0 |
| 0.9993055555555556 | 0 |